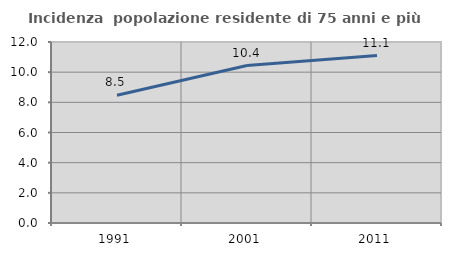
| Category | Incidenza  popolazione residente di 75 anni e più |
|---|---|
| 1991.0 | 8.475 |
| 2001.0 | 10.44 |
| 2011.0 | 11.104 |